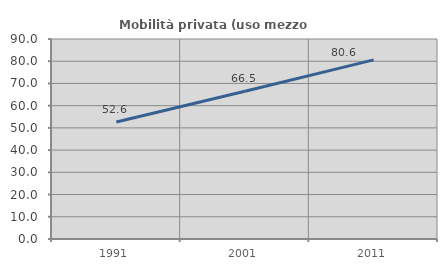
| Category | Mobilità privata (uso mezzo privato) |
|---|---|
| 1991.0 | 52.617 |
| 2001.0 | 66.479 |
| 2011.0 | 80.595 |